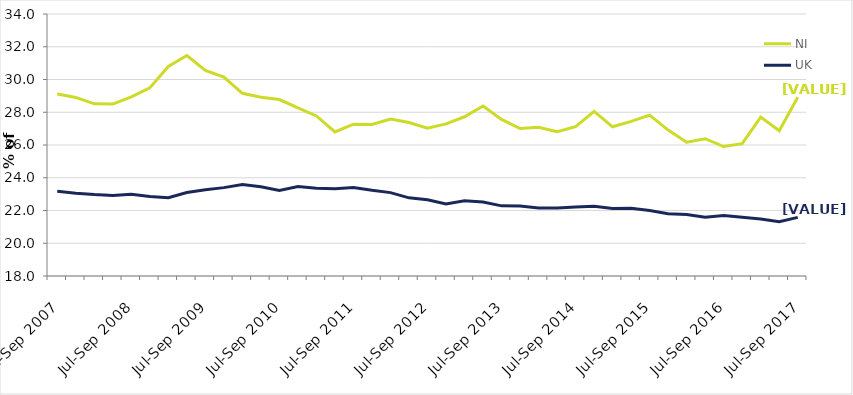
| Category | NI | UK |
|---|---|---|
| Jul-Sep 2007 | 29.113 | 23.179 |
| Oct-Dec 2007 | 28.904 | 23.058 |
| Jan-Mar 2008 | 28.512 | 22.974 |
| Apr-Jun 2008 | 28.5 | 22.917 |
| Jul-Sep 2008 | 28.937 | 22.996 |
| Oct-Dec 2008 | 29.489 | 22.851 |
| Jan-Mar 2009 | 30.792 | 22.786 |
| Apr-Jun 2009 | 31.467 | 23.097 |
| Jul-Sep 2009 | 30.556 | 23.27 |
| Oct-Dec 2009 | 30.141 | 23.397 |
| Jan-Mar 2010 | 29.156 | 23.588 |
| Apr-Jun 2010 | 28.921 | 23.451 |
| Jul-Sep 2010 | 28.774 | 23.219 |
| Oct-Dec 2010 | 28.271 | 23.468 |
| Jan-Mar 2011 | 27.775 | 23.36 |
| Apr-Jun 2011 | 26.796 | 23.329 |
| Jul-Sep 2011 | 27.274 | 23.402 |
| Oct-Dec 2011 | 27.25 | 23.233 |
| Jan-Mar 2012 | 27.586 | 23.091 |
| Apr-Jun 2012 | 27.377 | 22.772 |
| Jul-Sep 2012 | 27.027 | 22.654 |
| Oct-Dec 2012 | 27.29 | 22.399 |
| Jan-Mar 2013 | 27.724 | 22.591 |
| Apr-Jun 2013 | 28.384 | 22.524 |
| Jul-Sep 2013 | 27.56 | 22.283 |
| Oct-Dec 2013 | 27.003 | 22.276 |
| Jan-Mar 2014 | 27.078 | 22.149 |
| Apr-Jun 2014 | 26.812 | 22.156 |
| Jul-Sep 2014 | 27.121 | 22.206 |
| Oct-Dec 2014 | 28.053 | 22.253 |
| Jan-Mar 2015 | 27.111 | 22.118 |
| Apr-Jun 2015 | 27.442 | 22.136 |
| Jul-Sep 2015 | 27.82 | 22.003 |
| Oct-Dec 2015 | 26.909 | 21.8 |
| Jan-Mar 2016 | 26.171 | 21.755 |
| Apr-Jun 2016 | 26.384 | 21.596 |
| Jul-Sep 2016 | 25.907 | 21.693 |
| Oct-Dec 2016 | 26.081 | 21.593 |
| Jan-Mar 2017 | 27.701 | 21.48 |
| Apr-Jun 2017 | 26.871 | 21.309 |
| Jul-Sep 2017 | 28.916 | 21.58 |